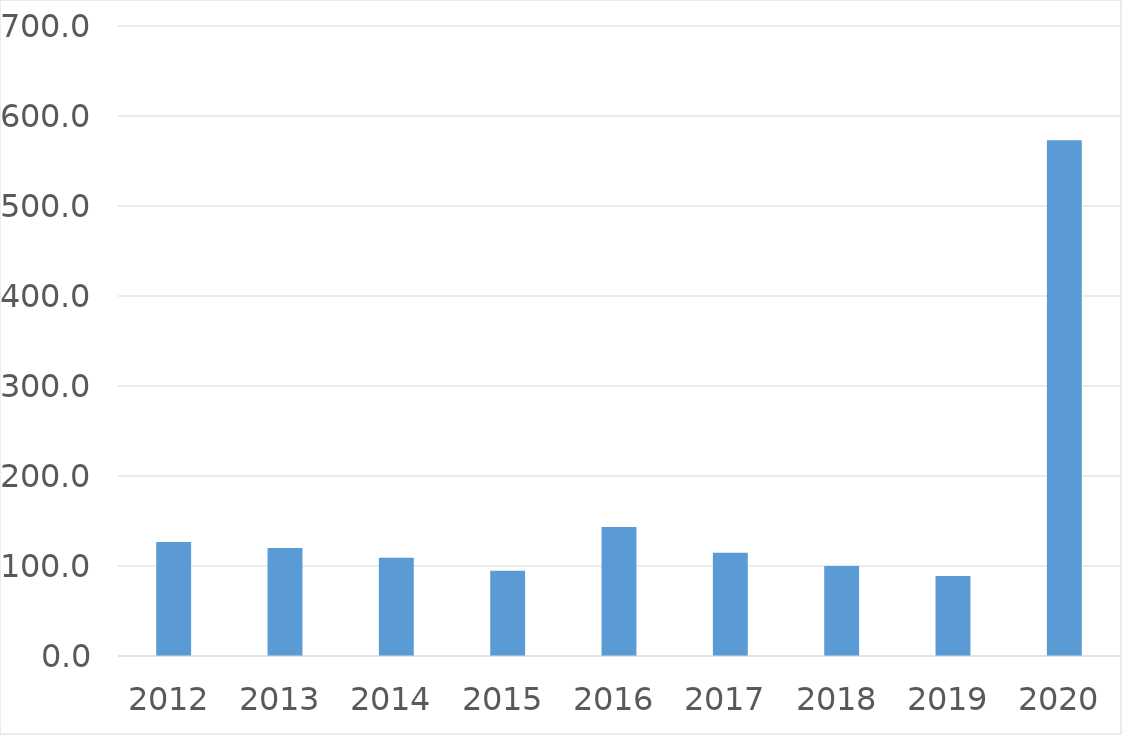
| Category | Series 0 |
|---|---|
| 2012 | 126.7 |
| 2013 | 120 |
| 2014 | 109.1 |
| 2015 | 94.6 |
| 2016 | 143.2 |
| 2017 | 114.8 |
| 2018 | 100.1 |
| 2019 | 88.9 |
| 2020 | 573.1 |